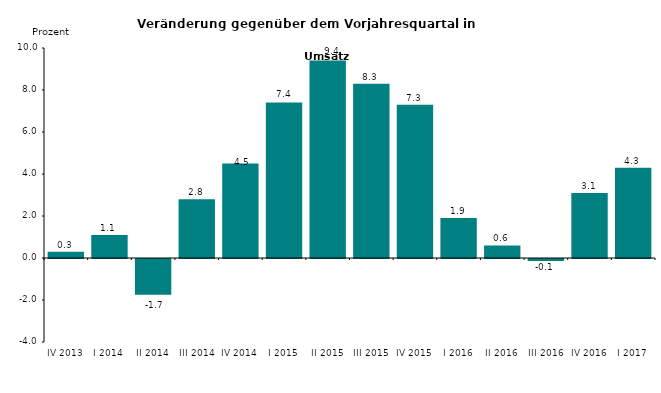
| Category | Series 0 |
|---|---|
| IV 2013 | 0.3 |
| I 2014 | 1.1 |
| II 2014 | -1.7 |
| III 2014 | 2.8 |
| IV 2014 | 4.5 |
| I 2015 | 7.4 |
| II 2015 | 9.4 |
| III 2015 | 8.3 |
| IV 2015 | 7.3 |
| I 2016 | 1.9 |
| II 2016 | 0.6 |
| III 2016 | -0.1 |
| IV 2016 | 3.1 |
| I 2017 | 4.3 |